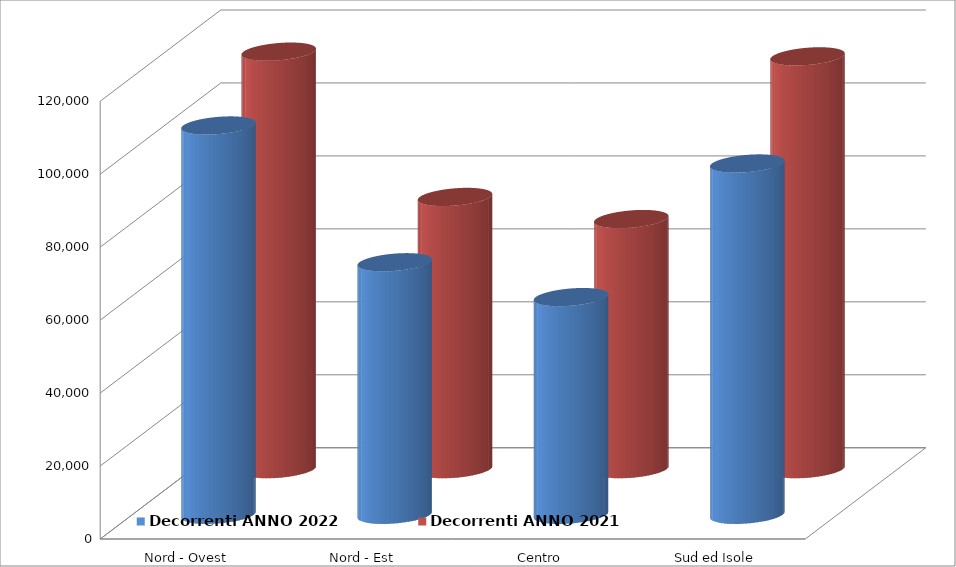
| Category | Decorrenti ANNO 2022 | Decorrenti ANNO 2021 |
|---|---|---|
| Nord - Ovest | 106726 | 114461 |
| Nord - Est | 69236 | 74631 |
| Centro | 59686 | 68574 |
| Sud ed Isole | 96311 | 113171 |